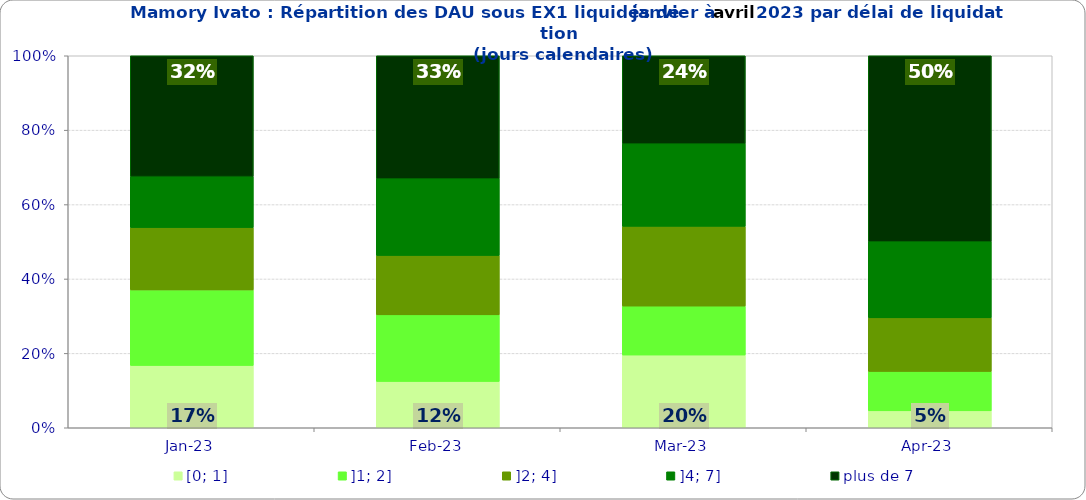
| Category | [0; 1] | ]1; 2] | ]2; 4] | ]4; 7] | plus de 7 |
|---|---|---|---|---|---|
| 2023-01-01 | 0.168 | 0.203 | 0.168 | 0.137 | 0.325 |
| 2023-02-01 | 0.125 | 0.179 | 0.16 | 0.206 | 0.331 |
| 2023-03-01 | 0.195 | 0.132 | 0.214 | 0.222 | 0.237 |
| 2023-04-01 | 0.045 | 0.106 | 0.144 | 0.205 | 0.5 |